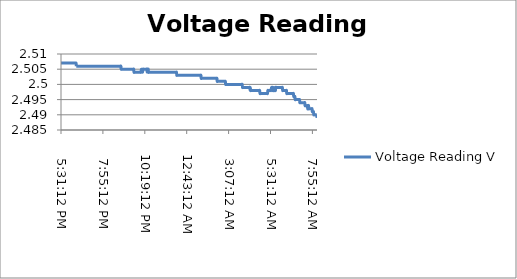
| Category | Voltage Reading V |
|---|---|
| 41667.729167 | 2.507 |
| 41667.729861 | 2.507 |
| 41667.730556 | 2.507 |
| 41667.73125 | 2.507 |
| 41667.731944 | 2.507 |
| 41667.732639 | 2.507 |
| 41667.733333 | 2.507 |
| 41667.734028 | 2.507 |
| 41667.734722 | 2.507 |
| 41667.735417 | 2.507 |
| 41667.736111 | 2.507 |
| 41667.736806 | 2.507 |
| 41667.7375 | 2.507 |
| 41667.738194 | 2.507 |
| 41667.738889 | 2.507 |
| 41667.739583 | 2.507 |
| 41667.740278 | 2.507 |
| 41667.740972 | 2.507 |
| 41667.741667 | 2.507 |
| 41667.742361 | 2.507 |
| 41667.743056 | 2.507 |
| 41667.74375 | 2.507 |
| 41667.744444 | 2.507 |
| 41667.745139 | 2.507 |
| 41667.745833 | 2.507 |
| 41667.746528 | 2.507 |
| 41667.747222 | 2.507 |
| 41667.747917 | 2.507 |
| 41667.748611 | 2.507 |
| 41667.749306 | 2.507 |
| 41667.75 | 2.507 |
| 41667.750694 | 2.507 |
| 41667.751389 | 2.507 |
| 41667.752083 | 2.507 |
| 41667.752778 | 2.507 |
| 41667.753472 | 2.507 |
| 41667.754167 | 2.507 |
| 41667.754861 | 2.507 |
| 41667.755556 | 2.507 |
| 41667.75625 | 2.507 |
| 41667.756944 | 2.507 |
| 41667.757639 | 2.507 |
| 41667.758333 | 2.507 |
| 41667.759028 | 2.507 |
| 41667.759722 | 2.507 |
| 41667.760417 | 2.507 |
| 41667.761111 | 2.507 |
| 41667.761806 | 2.507 |
| 41667.7625 | 2.507 |
| 41667.763194 | 2.507 |
| 41667.763889 | 2.507 |
| 41667.764583 | 2.507 |
| 41667.765278 | 2.507 |
| 41667.765972 | 2.507 |
| 41667.766667 | 2.506 |
| 41667.767361 | 2.506 |
| 41667.768056 | 2.506 |
| 41667.76875 | 2.506 |
| 41667.769444 | 2.506 |
| 41667.770139 | 2.506 |
| 41667.770833 | 2.506 |
| 41667.771528 | 2.506 |
| 41667.772222 | 2.506 |
| 41667.772917 | 2.506 |
| 41667.773611 | 2.506 |
| 41667.774306 | 2.506 |
| 41667.775 | 2.506 |
| 41667.775694 | 2.506 |
| 41667.776389 | 2.506 |
| 41667.777083 | 2.506 |
| 41667.777778 | 2.506 |
| 41667.778472 | 2.506 |
| 41667.779167 | 2.506 |
| 41667.779861 | 2.506 |
| 41667.780556 | 2.506 |
| 41667.78125 | 2.506 |
| 41667.781944 | 2.506 |
| 41667.782639 | 2.506 |
| 41667.783333 | 2.506 |
| 41667.784028 | 2.506 |
| 41667.784722 | 2.506 |
| 41667.785417 | 2.506 |
| 41667.786111 | 2.506 |
| 41667.786806 | 2.506 |
| 41667.7875 | 2.506 |
| 41667.788194 | 2.506 |
| 41667.788889 | 2.506 |
| 41667.789583 | 2.506 |
| 41667.790278 | 2.506 |
| 41667.790972 | 2.506 |
| 41667.791667 | 2.506 |
| 41667.792361 | 2.506 |
| 41667.793056 | 2.506 |
| 41667.79375 | 2.506 |
| 41667.794444 | 2.506 |
| 41667.795139 | 2.506 |
| 41667.795833 | 2.506 |
| 41667.796528 | 2.506 |
| 41667.797222 | 2.506 |
| 41667.797917 | 2.506 |
| 41667.798611 | 2.506 |
| 41667.799306 | 2.506 |
| 41667.8 | 2.506 |
| 41667.800694 | 2.506 |
| 41667.801389 | 2.506 |
| 41667.802083 | 2.506 |
| 41667.802778 | 2.506 |
| 41667.803472 | 2.506 |
| 41667.804167 | 2.506 |
| 41667.804861 | 2.506 |
| 41667.805556 | 2.506 |
| 41667.80625 | 2.506 |
| 41667.806944 | 2.506 |
| 41667.807639 | 2.506 |
| 41667.808333 | 2.506 |
| 41667.809028 | 2.506 |
| 41667.809722 | 2.506 |
| 41667.810417 | 2.506 |
| 41667.811111 | 2.506 |
| 41667.811806 | 2.506 |
| 41667.8125 | 2.506 |
| 41667.813194 | 2.506 |
| 41667.813889 | 2.506 |
| 41667.814583 | 2.506 |
| 41667.815278 | 2.506 |
| 41667.815972 | 2.506 |
| 41667.816667 | 2.506 |
| 41667.817361 | 2.506 |
| 41667.818056 | 2.506 |
| 41667.81875 | 2.506 |
| 41667.819444 | 2.506 |
| 41667.820139 | 2.506 |
| 41667.820833 | 2.506 |
| 41667.821528 | 2.506 |
| 41667.822222 | 2.506 |
| 41667.822917 | 2.506 |
| 41667.823611 | 2.506 |
| 41667.824306 | 2.506 |
| 41667.825 | 2.506 |
| 41667.825694 | 2.506 |
| 41667.826389 | 2.506 |
| 41667.827083 | 2.506 |
| 41667.827778 | 2.506 |
| 41667.828472 | 2.506 |
| 41667.829167 | 2.506 |
| 41667.829861 | 2.506 |
| 41667.830556 | 2.506 |
| 41667.83125 | 2.506 |
| 41667.831944 | 2.506 |
| 41667.832639 | 2.506 |
| 41667.833333 | 2.506 |
| 41667.834028 | 2.506 |
| 41667.834722 | 2.506 |
| 41667.835417 | 2.506 |
| 41667.836111 | 2.506 |
| 41667.836806 | 2.506 |
| 41667.8375 | 2.506 |
| 41667.838194 | 2.506 |
| 41667.838889 | 2.506 |
| 41667.839583 | 2.506 |
| 41667.840278 | 2.506 |
| 41667.840972 | 2.506 |
| 41667.841667 | 2.506 |
| 41667.842361 | 2.506 |
| 41667.843056 | 2.506 |
| 41667.84375 | 2.506 |
| 41667.844444 | 2.506 |
| 41667.845139 | 2.506 |
| 41667.845833 | 2.506 |
| 41667.846528 | 2.506 |
| 41667.847222 | 2.506 |
| 41667.847917 | 2.506 |
| 41667.848611 | 2.506 |
| 41667.849306 | 2.506 |
| 41667.85 | 2.506 |
| 41667.850694 | 2.506 |
| 41667.851389 | 2.506 |
| 41667.852083 | 2.506 |
| 41667.852778 | 2.506 |
| 41667.853472 | 2.506 |
| 41667.854167 | 2.506 |
| 41667.854861 | 2.506 |
| 41667.855556 | 2.506 |
| 41667.85625 | 2.506 |
| 41667.856944 | 2.506 |
| 41667.857639 | 2.506 |
| 41667.858333 | 2.506 |
| 41667.859028 | 2.506 |
| 41667.859722 | 2.506 |
| 41667.860417 | 2.506 |
| 41667.861111 | 2.506 |
| 41667.861806 | 2.506 |
| 41667.8625 | 2.506 |
| 41667.863194 | 2.506 |
| 41667.863889 | 2.506 |
| 41667.864583 | 2.506 |
| 41667.865278 | 2.506 |
| 41667.865972 | 2.506 |
| 41667.866667 | 2.506 |
| 41667.867361 | 2.506 |
| 41667.868056 | 2.506 |
| 41667.86875 | 2.506 |
| 41667.869444 | 2.506 |
| 41667.870139 | 2.506 |
| 41667.870833 | 2.506 |
| 41667.871528 | 2.506 |
| 41667.872222 | 2.506 |
| 41667.872917 | 2.506 |
| 41667.873611 | 2.505 |
| 41667.874306 | 2.505 |
| 41667.875 | 2.505 |
| 41667.875694 | 2.505 |
| 41667.876389 | 2.505 |
| 41667.877083 | 2.505 |
| 41667.877778 | 2.505 |
| 41667.878472 | 2.505 |
| 41667.879167 | 2.505 |
| 41667.879861 | 2.505 |
| 41667.880556 | 2.505 |
| 41667.88125 | 2.505 |
| 41667.881944 | 2.505 |
| 41667.882639 | 2.505 |
| 41667.883333 | 2.505 |
| 41667.884028 | 2.505 |
| 41667.884722 | 2.505 |
| 41667.885417 | 2.505 |
| 41667.886111 | 2.505 |
| 41667.886806 | 2.505 |
| 41667.8875 | 2.505 |
| 41667.888194 | 2.505 |
| 41667.888889 | 2.505 |
| 41667.889583 | 2.505 |
| 41667.890278 | 2.505 |
| 41667.890972 | 2.505 |
| 41667.891667 | 2.505 |
| 41667.892361 | 2.505 |
| 41667.893056 | 2.505 |
| 41667.89375 | 2.505 |
| 41667.894444 | 2.505 |
| 41667.895139 | 2.505 |
| 41667.895833 | 2.505 |
| 41667.896528 | 2.505 |
| 41667.897222 | 2.505 |
| 41667.897917 | 2.505 |
| 41667.898611 | 2.505 |
| 41667.899306 | 2.505 |
| 41667.9 | 2.505 |
| 41667.900694 | 2.505 |
| 41667.901389 | 2.505 |
| 41667.902083 | 2.505 |
| 41667.902778 | 2.505 |
| 41667.903472 | 2.505 |
| 41667.904167 | 2.504 |
| 41667.904861 | 2.504 |
| 41667.905556 | 2.504 |
| 41667.90625 | 2.504 |
| 41667.906944 | 2.504 |
| 41667.907639 | 2.504 |
| 41667.908333 | 2.504 |
| 41667.909028 | 2.504 |
| 41667.909722 | 2.504 |
| 41667.910417 | 2.504 |
| 41667.911111 | 2.504 |
| 41667.911806 | 2.504 |
| 41667.9125 | 2.504 |
| 41667.913194 | 2.504 |
| 41667.913889 | 2.504 |
| 41667.914583 | 2.504 |
| 41667.915278 | 2.504 |
| 41667.915972 | 2.504 |
| 41667.916667 | 2.504 |
| 41667.917361 | 2.504 |
| 41667.918056 | 2.504 |
| 41667.91875 | 2.504 |
| 41667.919444 | 2.504 |
| 41667.920139 | 2.504 |
| 41667.920833 | 2.504 |
| 41667.921528 | 2.505 |
| 41667.922222 | 2.504 |
| 41667.922917 | 2.505 |
| 41667.923611 | 2.504 |
| 41667.924306 | 2.505 |
| 41667.925 | 2.504 |
| 41667.925694 | 2.505 |
| 41667.926389 | 2.505 |
| 41667.927083 | 2.505 |
| 41667.927778 | 2.505 |
| 41667.928472 | 2.505 |
| 41667.929167 | 2.505 |
| 41667.929861 | 2.505 |
| 41667.930556 | 2.505 |
| 41667.93125 | 2.505 |
| 41667.931944 | 2.505 |
| 41667.932639 | 2.505 |
| 41667.933333 | 2.505 |
| 41667.934028 | 2.505 |
| 41667.934722 | 2.505 |
| 41667.935417 | 2.504 |
| 41667.936111 | 2.505 |
| 41667.936806 | 2.505 |
| 41667.9375 | 2.505 |
| 41667.938194 | 2.505 |
| 41667.938889 | 2.504 |
| 41667.939583 | 2.504 |
| 41667.940278 | 2.504 |
| 41667.940972 | 2.504 |
| 41667.941667 | 2.504 |
| 41667.942361 | 2.504 |
| 41667.943056 | 2.504 |
| 41667.94375 | 2.504 |
| 41667.944444 | 2.504 |
| 41667.945139 | 2.504 |
| 41667.945833 | 2.504 |
| 41667.946528 | 2.504 |
| 41667.947222 | 2.504 |
| 41667.947917 | 2.504 |
| 41667.948611 | 2.504 |
| 41667.949306 | 2.504 |
| 41667.95 | 2.504 |
| 41667.950694 | 2.504 |
| 41667.951389 | 2.504 |
| 41667.952083 | 2.504 |
| 41667.952778 | 2.504 |
| 41667.953472 | 2.504 |
| 41667.954167 | 2.504 |
| 41667.954861 | 2.504 |
| 41667.955556 | 2.504 |
| 41667.95625 | 2.504 |
| 41667.956944 | 2.504 |
| 41667.957639 | 2.504 |
| 41667.958333 | 2.504 |
| 41667.959028 | 2.504 |
| 41667.959722 | 2.504 |
| 41667.960417 | 2.504 |
| 41667.961111 | 2.504 |
| 41667.961806 | 2.504 |
| 41667.9625 | 2.504 |
| 41667.963194 | 2.504 |
| 41667.963889 | 2.504 |
| 41667.964583 | 2.504 |
| 41667.965278 | 2.504 |
| 41667.965972 | 2.504 |
| 41667.966667 | 2.504 |
| 41667.967361 | 2.504 |
| 41667.968056 | 2.504 |
| 41667.96875 | 2.504 |
| 41667.969444 | 2.504 |
| 41667.970139 | 2.504 |
| 41667.970833 | 2.504 |
| 41667.971528 | 2.504 |
| 41667.972222 | 2.504 |
| 41667.972917 | 2.504 |
| 41667.973611 | 2.504 |
| 41667.974306 | 2.504 |
| 41667.975 | 2.504 |
| 41667.975694 | 2.504 |
| 41667.976389 | 2.504 |
| 41667.977083 | 2.504 |
| 41667.977778 | 2.504 |
| 41667.978472 | 2.504 |
| 41667.979167 | 2.504 |
| 41667.979861 | 2.504 |
| 41667.980556 | 2.504 |
| 41667.98125 | 2.504 |
| 41667.981944 | 2.504 |
| 41667.982639 | 2.504 |
| 41667.983333 | 2.504 |
| 41667.984028 | 2.504 |
| 41667.984722 | 2.504 |
| 41667.985417 | 2.504 |
| 41667.986111 | 2.504 |
| 41667.986806 | 2.504 |
| 41667.9875 | 2.504 |
| 41667.988194 | 2.504 |
| 41667.988889 | 2.504 |
| 41667.989583 | 2.504 |
| 41667.990278 | 2.504 |
| 41667.990972 | 2.504 |
| 41667.991667 | 2.504 |
| 41667.992361 | 2.504 |
| 41667.993056 | 2.504 |
| 41667.99375 | 2.504 |
| 41667.994444 | 2.504 |
| 41667.995139 | 2.504 |
| 41667.995833 | 2.504 |
| 41667.996528 | 2.504 |
| 41667.997222 | 2.504 |
| 41667.997917 | 2.504 |
| 41667.998611 | 2.504 |
| 41667.999306 | 2.504 |
| 41668.0 | 2.504 |
| 41668.000694 | 2.504 |
| 41668.001389 | 2.504 |
| 41668.002083 | 2.504 |
| 41668.002778 | 2.504 |
| 41668.003472 | 2.504 |
| 41668.004167 | 2.504 |
| 41668.004861 | 2.504 |
| 41668.005556 | 2.504 |
| 41668.00625 | 2.503 |
| 41668.006944 | 2.503 |
| 41668.007639 | 2.503 |
| 41668.008333 | 2.503 |
| 41668.009028 | 2.503 |
| 41668.009722 | 2.503 |
| 41668.010417 | 2.503 |
| 41668.011111 | 2.503 |
| 41668.011806 | 2.503 |
| 41668.0125 | 2.503 |
| 41668.013194 | 2.503 |
| 41668.013889 | 2.503 |
| 41668.014583 | 2.503 |
| 41668.015278 | 2.503 |
| 41668.015972 | 2.503 |
| 41668.016667 | 2.503 |
| 41668.017361 | 2.503 |
| 41668.018056 | 2.503 |
| 41668.01875 | 2.503 |
| 41668.019444 | 2.503 |
| 41668.020139 | 2.503 |
| 41668.020833 | 2.503 |
| 41668.021528 | 2.503 |
| 41668.022222 | 2.503 |
| 41668.022917 | 2.503 |
| 41668.023611 | 2.503 |
| 41668.024306 | 2.503 |
| 41668.025 | 2.503 |
| 41668.025694 | 2.503 |
| 41668.026389 | 2.503 |
| 41668.027083 | 2.503 |
| 41668.027778 | 2.503 |
| 41668.028472 | 2.503 |
| 41668.029167 | 2.503 |
| 41668.029861 | 2.503 |
| 41668.030556 | 2.503 |
| 41668.03125 | 2.503 |
| 41668.031944 | 2.503 |
| 41668.032639 | 2.503 |
| 41668.033333 | 2.503 |
| 41668.034028 | 2.503 |
| 41668.034722 | 2.503 |
| 41668.035417 | 2.503 |
| 41668.036111 | 2.503 |
| 41668.036806 | 2.503 |
| 41668.0375 | 2.503 |
| 41668.038194 | 2.503 |
| 41668.038889 | 2.503 |
| 41668.039583 | 2.503 |
| 41668.040278 | 2.503 |
| 41668.040972 | 2.503 |
| 41668.041667 | 2.503 |
| 41668.042361 | 2.503 |
| 41668.043056 | 2.503 |
| 41668.04375 | 2.503 |
| 41668.044444 | 2.503 |
| 41668.045139 | 2.503 |
| 41668.045833 | 2.503 |
| 41668.046528 | 2.503 |
| 41668.047222 | 2.503 |
| 41668.047917 | 2.503 |
| 41668.048611 | 2.503 |
| 41668.049306 | 2.503 |
| 41668.05 | 2.503 |
| 41668.050694 | 2.503 |
| 41668.051389 | 2.503 |
| 41668.052083 | 2.503 |
| 41668.052778 | 2.503 |
| 41668.053472 | 2.503 |
| 41668.054167 | 2.503 |
| 41668.054861 | 2.503 |
| 41668.055556 | 2.503 |
| 41668.05625 | 2.503 |
| 41668.056944 | 2.503 |
| 41668.057639 | 2.503 |
| 41668.058333 | 2.503 |
| 41668.059028 | 2.503 |
| 41668.059722 | 2.503 |
| 41668.060417 | 2.503 |
| 41668.061111 | 2.503 |
| 41668.061806 | 2.503 |
| 41668.0625 | 2.503 |
| 41668.063194 | 2.503 |
| 41668.063889 | 2.503 |
| 41668.064583 | 2.502 |
| 41668.065278 | 2.502 |
| 41668.065972 | 2.502 |
| 41668.066667 | 2.502 |
| 41668.067361 | 2.502 |
| 41668.068056 | 2.502 |
| 41668.06875 | 2.502 |
| 41668.069444 | 2.502 |
| 41668.070139 | 2.502 |
| 41668.070833 | 2.502 |
| 41668.071528 | 2.502 |
| 41668.072222 | 2.502 |
| 41668.072917 | 2.502 |
| 41668.073611 | 2.502 |
| 41668.074306 | 2.502 |
| 41668.075 | 2.502 |
| 41668.075694 | 2.502 |
| 41668.076389 | 2.502 |
| 41668.077083 | 2.502 |
| 41668.077778 | 2.502 |
| 41668.078472 | 2.502 |
| 41668.079167 | 2.502 |
| 41668.079861 | 2.502 |
| 41668.080556 | 2.502 |
| 41668.08125 | 2.502 |
| 41668.081944 | 2.502 |
| 41668.082639 | 2.502 |
| 41668.083333 | 2.502 |
| 41668.084028 | 2.502 |
| 41668.084722 | 2.502 |
| 41668.085417 | 2.502 |
| 41668.086111 | 2.502 |
| 41668.086806 | 2.502 |
| 41668.0875 | 2.502 |
| 41668.088194 | 2.502 |
| 41668.088889 | 2.502 |
| 41668.089583 | 2.502 |
| 41668.090278 | 2.502 |
| 41668.090972 | 2.502 |
| 41668.091667 | 2.502 |
| 41668.092361 | 2.502 |
| 41668.093056 | 2.502 |
| 41668.09375 | 2.502 |
| 41668.094444 | 2.502 |
| 41668.095139 | 2.502 |
| 41668.095833 | 2.502 |
| 41668.096528 | 2.502 |
| 41668.097222 | 2.502 |
| 41668.097917 | 2.502 |
| 41668.098611 | 2.502 |
| 41668.099306 | 2.502 |
| 41668.1 | 2.502 |
| 41668.100694 | 2.502 |
| 41668.101389 | 2.502 |
| 41668.102083 | 2.502 |
| 41668.102778 | 2.501 |
| 41668.103472 | 2.501 |
| 41668.104167 | 2.501 |
| 41668.104861 | 2.501 |
| 41668.105556 | 2.501 |
| 41668.10625 | 2.501 |
| 41668.106944 | 2.501 |
| 41668.107639 | 2.501 |
| 41668.108333 | 2.501 |
| 41668.109028 | 2.501 |
| 41668.109722 | 2.501 |
| 41668.110417 | 2.501 |
| 41668.111111 | 2.501 |
| 41668.111806 | 2.501 |
| 41668.1125 | 2.501 |
| 41668.113194 | 2.501 |
| 41668.113889 | 2.501 |
| 41668.114583 | 2.501 |
| 41668.115278 | 2.501 |
| 41668.115972 | 2.501 |
| 41668.116667 | 2.501 |
| 41668.117361 | 2.501 |
| 41668.118056 | 2.501 |
| 41668.11875 | 2.501 |
| 41668.119444 | 2.501 |
| 41668.120139 | 2.501 |
| 41668.120833 | 2.501 |
| 41668.121528 | 2.501 |
| 41668.122222 | 2.501 |
| 41668.122917 | 2.5 |
| 41668.123611 | 2.5 |
| 41668.124306 | 2.5 |
| 41668.125 | 2.5 |
| 41668.125694 | 2.5 |
| 41668.126389 | 2.5 |
| 41668.127083 | 2.5 |
| 41668.127778 | 2.5 |
| 41668.128472 | 2.5 |
| 41668.129167 | 2.5 |
| 41668.129861 | 2.5 |
| 41668.130556 | 2.5 |
| 41668.13125 | 2.5 |
| 41668.131944 | 2.5 |
| 41668.132639 | 2.5 |
| 41668.133333 | 2.5 |
| 41668.134028 | 2.5 |
| 41668.134722 | 2.5 |
| 41668.135417 | 2.5 |
| 41668.136111 | 2.5 |
| 41668.136806 | 2.5 |
| 41668.1375 | 2.5 |
| 41668.138194 | 2.5 |
| 41668.138889 | 2.5 |
| 41668.139583 | 2.5 |
| 41668.140278 | 2.5 |
| 41668.140972 | 2.5 |
| 41668.141667 | 2.5 |
| 41668.142361 | 2.5 |
| 41668.143056 | 2.5 |
| 41668.14375 | 2.5 |
| 41668.144444 | 2.5 |
| 41668.145139 | 2.5 |
| 41668.145833 | 2.5 |
| 41668.146528 | 2.5 |
| 41668.147222 | 2.5 |
| 41668.147917 | 2.5 |
| 41668.148611 | 2.5 |
| 41668.149306 | 2.5 |
| 41668.15 | 2.5 |
| 41668.150694 | 2.5 |
| 41668.151389 | 2.5 |
| 41668.152083 | 2.5 |
| 41668.152778 | 2.5 |
| 41668.153472 | 2.5 |
| 41668.154167 | 2.5 |
| 41668.154861 | 2.5 |
| 41668.155556 | 2.5 |
| 41668.15625 | 2.5 |
| 41668.156944 | 2.5 |
| 41668.157639 | 2.5 |
| 41668.158333 | 2.5 |
| 41668.159028 | 2.5 |
| 41668.159722 | 2.5 |
| 41668.160417 | 2.5 |
| 41668.161111 | 2.5 |
| 41668.161806 | 2.5 |
| 41668.1625 | 2.5 |
| 41668.163194 | 2.499 |
| 41668.163889 | 2.499 |
| 41668.164583 | 2.499 |
| 41668.165278 | 2.499 |
| 41668.165972 | 2.499 |
| 41668.166667 | 2.499 |
| 41668.167361 | 2.499 |
| 41668.168056 | 2.499 |
| 41668.16875 | 2.499 |
| 41668.169444 | 2.499 |
| 41668.170139 | 2.499 |
| 41668.170833 | 2.499 |
| 41668.171528 | 2.499 |
| 41668.172222 | 2.499 |
| 41668.172917 | 2.499 |
| 41668.173611 | 2.499 |
| 41668.174306 | 2.499 |
| 41668.175 | 2.499 |
| 41668.175694 | 2.499 |
| 41668.176389 | 2.499 |
| 41668.177083 | 2.499 |
| 41668.177778 | 2.499 |
| 41668.178472 | 2.499 |
| 41668.179167 | 2.499 |
| 41668.179861 | 2.499 |
| 41668.180556 | 2.499 |
| 41668.18125 | 2.498 |
| 41668.181944 | 2.499 |
| 41668.182639 | 2.498 |
| 41668.183333 | 2.498 |
| 41668.184028 | 2.498 |
| 41668.184722 | 2.498 |
| 41668.185417 | 2.498 |
| 41668.186111 | 2.498 |
| 41668.186806 | 2.498 |
| 41668.1875 | 2.498 |
| 41668.188194 | 2.498 |
| 41668.188889 | 2.498 |
| 41668.189583 | 2.498 |
| 41668.190278 | 2.498 |
| 41668.190972 | 2.498 |
| 41668.191667 | 2.498 |
| 41668.192361 | 2.498 |
| 41668.193056 | 2.498 |
| 41668.19375 | 2.498 |
| 41668.194444 | 2.498 |
| 41668.195139 | 2.498 |
| 41668.195833 | 2.498 |
| 41668.196528 | 2.498 |
| 41668.197222 | 2.498 |
| 41668.197917 | 2.498 |
| 41668.198611 | 2.498 |
| 41668.199306 | 2.498 |
| 41668.2 | 2.498 |
| 41668.200694 | 2.498 |
| 41668.201389 | 2.498 |
| 41668.202083 | 2.498 |
| 41668.202778 | 2.498 |
| 41668.203472 | 2.498 |
| 41668.204167 | 2.498 |
| 41668.204861 | 2.497 |
| 41668.205556 | 2.497 |
| 41668.20625 | 2.497 |
| 41668.206944 | 2.497 |
| 41668.207639 | 2.497 |
| 41668.208333 | 2.497 |
| 41668.209028 | 2.497 |
| 41668.209722 | 2.497 |
| 41668.210417 | 2.497 |
| 41668.211111 | 2.497 |
| 41668.211806 | 2.497 |
| 41668.2125 | 2.497 |
| 41668.213194 | 2.497 |
| 41668.213889 | 2.497 |
| 41668.214583 | 2.497 |
| 41668.215278 | 2.497 |
| 41668.215972 | 2.497 |
| 41668.216667 | 2.497 |
| 41668.217361 | 2.497 |
| 41668.218056 | 2.497 |
| 41668.21875 | 2.497 |
| 41668.219444 | 2.497 |
| 41668.220139 | 2.497 |
| 41668.220833 | 2.497 |
| 41668.221528 | 2.497 |
| 41668.222222 | 2.497 |
| 41668.222917 | 2.497 |
| 41668.223611 | 2.498 |
| 41668.224306 | 2.498 |
| 41668.225 | 2.498 |
| 41668.225694 | 2.498 |
| 41668.226389 | 2.498 |
| 41668.227083 | 2.498 |
| 41668.227778 | 2.498 |
| 41668.228472 | 2.498 |
| 41668.229167 | 2.498 |
| 41668.229861 | 2.498 |
| 41668.230556 | 2.498 |
| 41668.23125 | 2.498 |
| 41668.231944 | 2.499 |
| 41668.232639 | 2.498 |
| 41668.233333 | 2.499 |
| 41668.234028 | 2.499 |
| 41668.234722 | 2.499 |
| 41668.235417 | 2.498 |
| 41668.236111 | 2.498 |
| 41668.236806 | 2.498 |
| 41668.2375 | 2.498 |
| 41668.238194 | 2.499 |
| 41668.238889 | 2.498 |
| 41668.239583 | 2.498 |
| 41668.240278 | 2.498 |
| 41668.240972 | 2.498 |
| 41668.241667 | 2.498 |
| 41668.242361 | 2.499 |
| 41668.243056 | 2.499 |
| 41668.24375 | 2.499 |
| 41668.244444 | 2.499 |
| 41668.245139 | 2.499 |
| 41668.245833 | 2.499 |
| 41668.246528 | 2.499 |
| 41668.247222 | 2.499 |
| 41668.247917 | 2.499 |
| 41668.248611 | 2.499 |
| 41668.249306 | 2.499 |
| 41668.25 | 2.499 |
| 41668.250694 | 2.499 |
| 41668.251389 | 2.499 |
| 41668.252083 | 2.499 |
| 41668.252778 | 2.499 |
| 41668.253472 | 2.499 |
| 41668.254167 | 2.499 |
| 41668.254861 | 2.499 |
| 41668.255556 | 2.499 |
| 41668.25625 | 2.499 |
| 41668.256944 | 2.499 |
| 41668.257639 | 2.499 |
| 41668.258333 | 2.499 |
| 41668.259028 | 2.498 |
| 41668.259722 | 2.498 |
| 41668.260417 | 2.498 |
| 41668.261111 | 2.498 |
| 41668.261806 | 2.498 |
| 41668.2625 | 2.498 |
| 41668.263194 | 2.498 |
| 41668.263889 | 2.498 |
| 41668.264583 | 2.498 |
| 41668.265278 | 2.498 |
| 41668.265972 | 2.498 |
| 41668.266667 | 2.498 |
| 41668.267361 | 2.498 |
| 41668.268056 | 2.498 |
| 41668.26875 | 2.497 |
| 41668.269444 | 2.497 |
| 41668.270139 | 2.497 |
| 41668.270833 | 2.497 |
| 41668.271528 | 2.497 |
| 41668.272222 | 2.497 |
| 41668.272917 | 2.497 |
| 41668.273611 | 2.497 |
| 41668.274306 | 2.497 |
| 41668.275 | 2.497 |
| 41668.275694 | 2.497 |
| 41668.276389 | 2.497 |
| 41668.277083 | 2.497 |
| 41668.277778 | 2.497 |
| 41668.278472 | 2.497 |
| 41668.279167 | 2.497 |
| 41668.279861 | 2.497 |
| 41668.280556 | 2.497 |
| 41668.28125 | 2.497 |
| 41668.281944 | 2.497 |
| 41668.282639 | 2.497 |
| 41668.283333 | 2.497 |
| 41668.284028 | 2.497 |
| 41668.284722 | 2.497 |
| 41668.285417 | 2.496 |
| 41668.286111 | 2.496 |
| 41668.286806 | 2.496 |
| 41668.2875 | 2.496 |
| 41668.288194 | 2.496 |
| 41668.288889 | 2.495 |
| 41668.289583 | 2.495 |
| 41668.290278 | 2.495 |
| 41668.290972 | 2.495 |
| 41668.291667 | 2.495 |
| 41668.292361 | 2.495 |
| 41668.293056 | 2.495 |
| 41668.29375 | 2.495 |
| 41668.294444 | 2.495 |
| 41668.295139 | 2.495 |
| 41668.295833 | 2.495 |
| 41668.296528 | 2.495 |
| 41668.297222 | 2.495 |
| 41668.297917 | 2.495 |
| 41668.298611 | 2.495 |
| 41668.299306 | 2.495 |
| 41668.3 | 2.494 |
| 41668.300694 | 2.494 |
| 41668.301389 | 2.494 |
| 41668.302083 | 2.494 |
| 41668.302778 | 2.494 |
| 41668.303472 | 2.494 |
| 41668.304167 | 2.494 |
| 41668.304861 | 2.494 |
| 41668.305556 | 2.494 |
| 41668.30625 | 2.494 |
| 41668.306944 | 2.494 |
| 41668.307639 | 2.494 |
| 41668.308333 | 2.494 |
| 41668.309028 | 2.494 |
| 41668.309722 | 2.494 |
| 41668.310417 | 2.494 |
| 41668.311111 | 2.494 |
| 41668.311806 | 2.494 |
| 41668.3125 | 2.493 |
| 41668.313194 | 2.493 |
| 41668.313889 | 2.493 |
| 41668.314583 | 2.493 |
| 41668.315278 | 2.493 |
| 41668.315972 | 2.493 |
| 41668.316667 | 2.493 |
| 41668.317361 | 2.493 |
| 41668.318056 | 2.493 |
| 41668.31875 | 2.492 |
| 41668.319444 | 2.492 |
| 41668.320139 | 2.493 |
| 41668.320833 | 2.493 |
| 41668.321528 | 2.492 |
| 41668.322222 | 2.492 |
| 41668.322917 | 2.492 |
| 41668.323611 | 2.492 |
| 41668.324306 | 2.492 |
| 41668.325 | 2.492 |
| 41668.325694 | 2.492 |
| 41668.326389 | 2.492 |
| 41668.327083 | 2.492 |
| 41668.327778 | 2.492 |
| 41668.328472 | 2.492 |
| 41668.329167 | 2.492 |
| 41668.329861 | 2.491 |
| 41668.330556 | 2.491 |
| 41668.33125 | 2.491 |
| 41668.331944 | 2.491 |
| 41668.332639 | 2.491 |
| 41668.333333 | 2.49 |
| 41668.334028 | 2.49 |
| 41668.334722 | 2.49 |
| 41668.335417 | 2.49 |
| 41668.336111 | 2.49 |
| 41668.336806 | 2.49 |
| 41668.3375 | 2.49 |
| 41668.338194 | 2.49 |
| 41668.338889 | 2.49 |
| 41668.339583 | 2.49 |
| 41668.340278 | 2.49 |
| 41668.340972 | 2.489 |